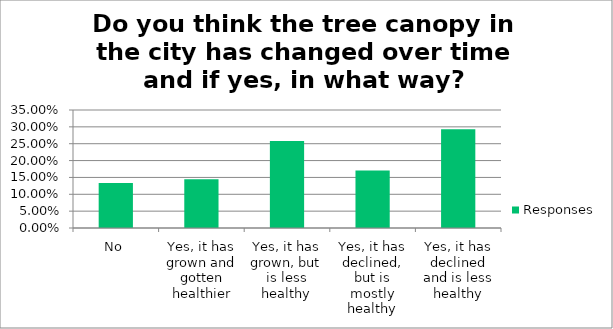
| Category | Responses |
|---|---|
| No | 0.134 |
| Yes, it has grown and gotten healthier | 0.145 |
| Yes, it has grown, but is less healthy | 0.258 |
| Yes, it has declined, but is mostly healthy | 0.171 |
| Yes, it has declined and is less healthy | 0.293 |